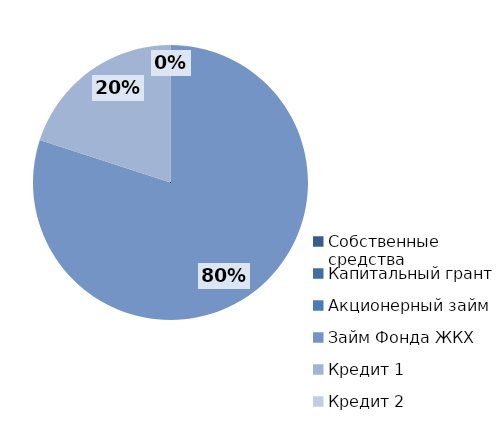
| Category | Series 0 |
|---|---|
| Собственные средства | 0 |
| Капитальный грант | 0 |
| Акционерный займ | 0 |
| Займ Фонда ЖКХ | 48000 |
| Кредит 1 | 12000 |
| Кредит 2 | 0 |